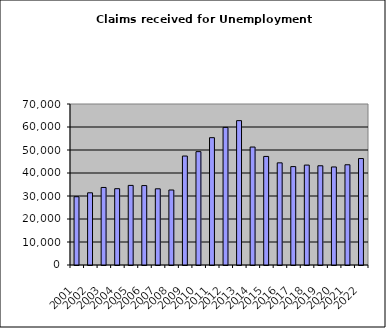
| Category | Series 1 |
|---|---|
| 2001.0 | 29694 |
| 2002.0 | 31386 |
| 2003.0 | 33712 |
| 2004.0 | 33179 |
| 2005.0 | 34612 |
| 2006.0 | 34527 |
| 2007.0 | 33131 |
| 2008.0 | 32607 |
| 2009.0 | 47377 |
| 2010.0 | 49282 |
| 2011.0 | 55358 |
| 2012.0 | 59832 |
| 2013.0 | 62771 |
| 2014.0 | 51290 |
| 2015.0 | 47204 |
| 2016.0 | 44413 |
| 2017.0 | 42782 |
| 2018.0 | 43440 |
| 2019.0 | 43140 |
| 2020.0 | 42626 |
| 2021.0 | 43576 |
| 2022.0 | 46290 |